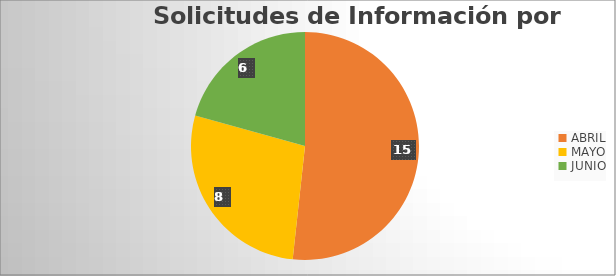
| Category | Series 0 |
|---|---|
| ABRIL | 15 |
| MAYO | 8 |
| JUNIO | 6 |